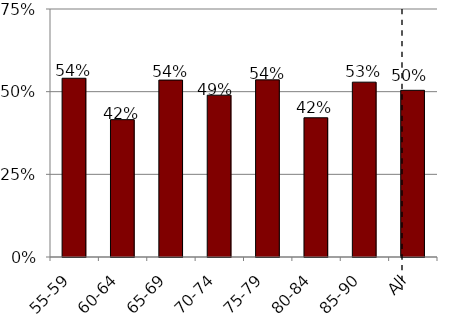
| Category | Series 0 |
|---|---|
| 55-59 | 0.541 |
| 60-64 | 0.415 |
| 65-69 | 0.535 |
| 70-74 | 0.489 |
| 75-79 | 0.536 |
| 80-84 | 0.421 |
| 85-90 | 0.529 |
| All | 0.504 |